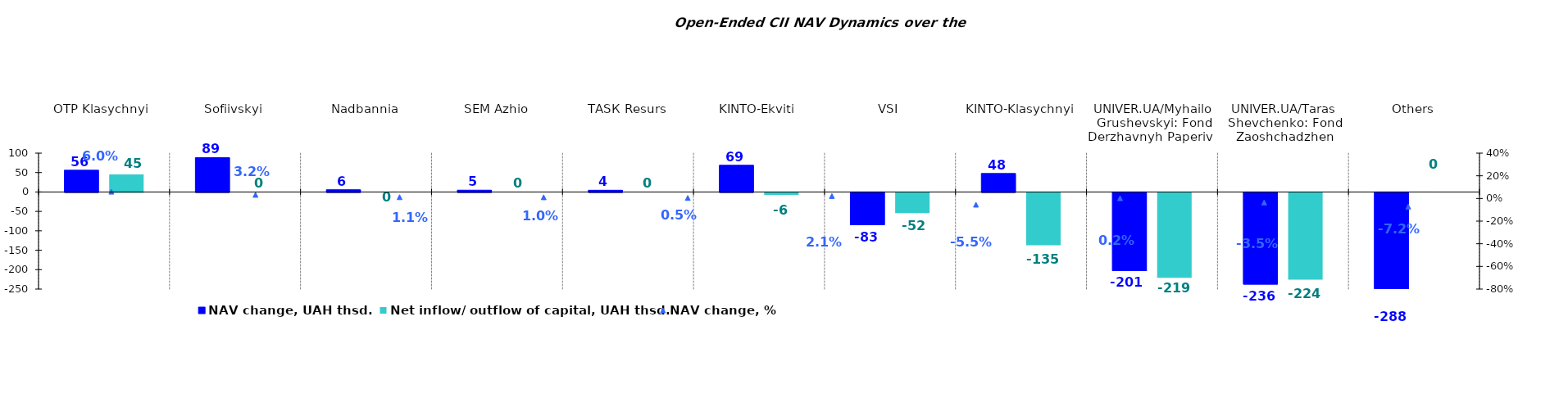
| Category | NAV change, UAH thsd. | Net inflow/ outflow of capital, UAH thsd. |
|---|---|---|
| OTP Klasychnyi  | 56.018 | 45.329 |
| Sofiivskyi | 88.55 | 0 |
| Nadbannia | 5.726 | 0 |
| SEM Azhio | 4.615 | 0 |
| ТАSК Resurs | 4.459 | 0 |
| KINTO-Ekviti | 68.827 | -5.552 |
| VSI | -83.211 | -52.121 |
| KINTO-Klasychnyi | 47.63 | -134.881 |
| UNIVER.UA/Myhailo Grushevskyi: Fond Derzhavnyh Paperiv    | -201.423 | -218.748 |
| UNIVER.UA/Taras Shevchenko: Fond Zaoshchadzhen | -236.085 | -223.884 |
| Others | -287.856 | 0 |